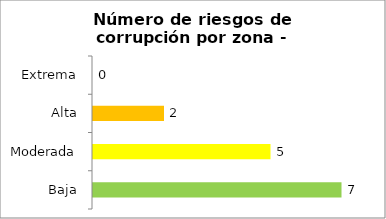
| Category | Series 0 |
|---|---|
| Baja | 7 |
| Moderada | 5 |
| Alta | 2 |
| Extrema | 0 |